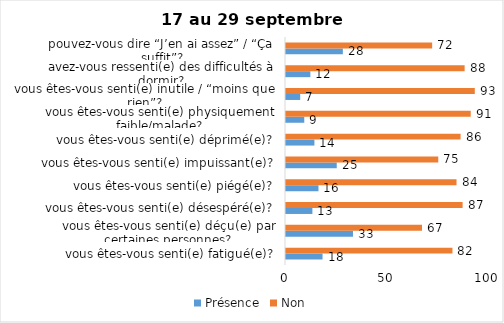
| Category | Présence | Non |
|---|---|---|
| vous êtes-vous senti(e) fatigué(e)? | 18 | 82 |
| vous êtes-vous senti(e) déçu(e) par certaines personnes? | 33 | 67 |
| vous êtes-vous senti(e) désespéré(e)? | 13 | 87 |
| vous êtes-vous senti(e) piégé(e)? | 16 | 84 |
| vous êtes-vous senti(e) impuissant(e)? | 25 | 75 |
| vous êtes-vous senti(e) déprimé(e)? | 14 | 86 |
| vous êtes-vous senti(e) physiquement faible/malade? | 9 | 91 |
| vous êtes-vous senti(e) inutile / “moins que rien”? | 7 | 93 |
| avez-vous ressenti(e) des difficultés à dormir? | 12 | 88 |
| pouvez-vous dire “J’en ai assez” / “Ça suffit”? | 28 | 72 |